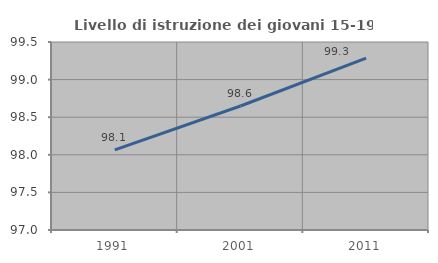
| Category | Livello di istruzione dei giovani 15-19 anni |
|---|---|
| 1991.0 | 98.065 |
| 2001.0 | 98.649 |
| 2011.0 | 99.286 |